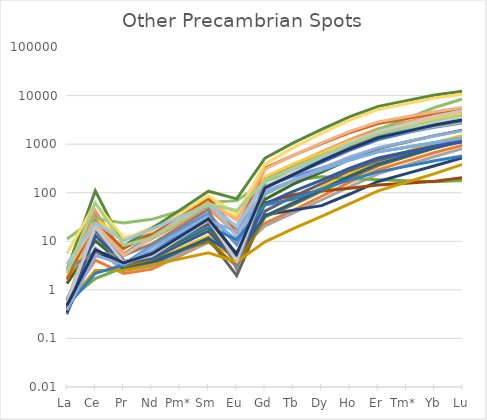
| Category | Series 0 | Series 1 | Series 2 | Series 3 | Series 4 | Series 5 | Series 6 | Series 7 | Series 8 | Series 9 | Series 10 | Series 11 | Series 12 | Series 13 | Series 14 | Series 15 | Series 16 | Series 17 | Series 18 | Series 19 | Series 20 | Series 21 | Series 22 | Series 23 | Series 24 | Series 25 | Series 26 | Series 27 | Series 28 | Series 29 | Series 30 |
|---|---|---|---|---|---|---|---|---|---|---|---|---|---|---|---|---|---|---|---|---|---|---|---|---|---|---|---|---|---|---|---|
| La | 0.314 | 0.555 | 0.654 | 1.385 | 0.463 | 0.576 | 0.344 | 0.52 | 0.404 | 0.49 | 0.594 | 1.342 | 0.463 | 1.733 | 0.566 | 1.689 | 0.499 | 11.128 | 0.441 | 1.619 | 2.714 | 0.512 | 0.46 | 2.56 | 0.384 | 2.617 | 0.536 | 5.568 | 3.427 | 2.215 | 0.479 |
| Ce | 33.59 | 4.086 | 7.234 | 14.26 | 20.554 | 1.708 | 6.051 | 17.637 | 26.353 | 17.637 | 14.935 | 10.247 | 32.414 | 42.505 | 27.645 | 29.003 | 13.965 | 29.507 | 13.022 | 25.609 | 5.874 | 2.491 | 2.196 | 109.871 | 5.074 | 22.54 | 19.523 | 61.089 | 23.946 | 61.658 | 6.712 |
| Pr | 3.387 | 2.179 | 2.515 | 3.847 | 5.496 | 2.885 | 3.571 | 3.549 | 4.029 | 3.031 | 2.629 | 3.347 | 3.417 | 5.319 | 4.997 | 10.696 | 3.192 | 23.895 | 3.682 | 7.027 | 5.077 | 2.535 | 3.25 | 7.998 | 3.351 | 5.106 | 3.722 | 11.906 | 10.194 | 8.255 | 3.59 |
| Nd | 6.089 | 2.674 | 3.059 | 3.937 | 13.261 | 4.186 | 5.981 | 4.935 | 3.376 | 4.084 | 3.714 | 5.232 | 8.194 | 11.252 | 12.01 | 19.15 | 7.467 | 28.337 | 4.526 | 14.87 | 8.824 | 3.26 | 5.746 | 18.237 | 5.975 | 12.071 | 5.037 | 15.968 | 17.857 | 11.799 | 5.531 |
| Pm* | 13.75 | 5.067 | 5.405 | 7.11 | 27.056 | 8.676 | 11.449 | 10.969 | 6.248 | 6.4 | 6.525 | 10.087 | 17.525 | 23.102 | 27.526 | 35.252 | 15.304 | 42.248 | 8.537 | 33.677 | 19.979 | 4.345 | 10.876 | 44.236 | 12.517 | 27.207 | 11.79 | 37.038 | 31.808 | 26.255 | 12.586 |
| Sm | 31.049 | 9.602 | 9.551 | 12.839 | 55.198 | 17.98 | 21.916 | 24.385 | 11.563 | 10.029 | 11.463 | 19.448 | 37.483 | 47.435 | 63.086 | 64.895 | 31.367 | 62.989 | 16.103 | 76.27 | 45.235 | 5.792 | 20.588 | 107.297 | 26.223 | 61.324 | 27.599 | 85.912 | 56.657 | 58.424 | 28.641 |
| Eu | 5.156 | 4.721 | 5.935 | 4.2 | 20.311 | 5.103 | 3.741 | 3.201 | 1.966 | 3.059 | 5.093 | 5.662 | 8.417 | 14.027 | 12.596 | 29.904 | 10.66 | 68.705 | 3.841 | 16.451 | 2.657 | 3.791 | 10.735 | 74.787 | 16.237 | 27.225 | 3.954 | 35.997 | 19.861 | 42.932 | 5.467 |
| Gd | 124.025 | 23.501 | 20.638 | 31.581 | 202.7 | 93.694 | 34.751 | 61.497 | 41.853 | 31.649 | 33.194 | 73.025 | 138.774 | 200.405 | 204.033 | 211.135 | 98.16 | 168.705 | 59.095 | 320.701 | 181.443 | 9.74 | 55.57 | 516.657 | 108.655 | 306.163 | 132.522 | 392.906 | 181.779 | 177.143 | 127.395 |
| Tb | 239.025 | 43.474 | 38.289 | 65.044 | 340.536 | 179.065 | 43.795 | 90.613 | 83.526 | 57.063 | 61.342 | 150.584 | 216.199 | 379.057 | 345.038 | 390.571 | 179.804 | 289.185 | 106.111 | 588.648 | 332.941 | 18.234 | 73.924 | 1060.006 | 179.73 | 588.653 | 283.22 | 845.184 | 309.626 | 323.11 | 235.138 |
| Dy | 421.995 | 84.649 | 70.781 | 129.611 | 559.167 | 213.868 | 54.149 | 108.182 | 153.024 | 107.326 | 115.645 | 266.901 | 323.52 | 692.405 | 572.72 | 653.473 | 292.06 | 498.472 | 181.893 | 1028.554 | 577.594 | 32.531 | 119.971 | 2007.14 | 317.378 | 1066.125 | 570.302 | 1676.021 | 509.592 | 572.196 | 450.553 |
| Ho | 754.224 | 164.62 | 133.489 | 247.714 | 899.818 | 196.943 | 94.056 | 123.514 | 287.033 | 199.785 | 220.158 | 483.755 | 486.666 | 1242.16 | 943.617 | 1138.813 | 467.043 | 966.572 | 321.511 | 1733.396 | 982.807 | 59.815 | 183.361 | 3680.766 | 544.059 | 1825.826 | 1083.781 | 3132.342 | 847.969 | 998.549 | 814.371 |
| Er | 1242.09 | 298.904 | 244.544 | 454.178 | 1345.24 | 184.78 | 170.529 | 143.598 | 466.49 | 362.84 | 390.639 | 816.461 | 695.174 | 2079.676 | 1434.426 | 1832.699 | 693.341 | 1986.798 | 520.818 | 2662.741 | 1523.232 | 109.539 | 268.449 | 6004.65 | 844.388 | 2873.164 | 1822.95 | 5177.207 | 1362.455 | 1625.616 | 1352.974 |
| Tm* | 1721.807 | 448.181 | 369.137 | 695.518 | 1734.929 | 176.063 | 247.491 | 156.896 | 644.889 | 547.706 | 574.598 | 1105.531 | 866.047 | 2830.026 | 1834.244 | 2468.726 | 866.815 | 3360.388 | 691.035 | 3369.513 | 1941.584 | 164.487 | 348.887 | 7867.903 | 1115.515 | 3659.522 | 2617.544 | 6788.834 | 1881.639 | 2212.533 | 1828.677 |
| Yb | 2386.798 | 672.01 | 557.211 | 1065.101 | 2237.505 | 167.757 | 359.188 | 171.425 | 891.513 | 826.761 | 845.186 | 1496.946 | 1078.921 | 3851.103 | 2345.504 | 3325.483 | 1083.693 | 5683.622 | 916.882 | 4263.885 | 2474.835 | 246.997 | 453.426 | 10309.326 | 1473.699 | 4661.099 | 3758.488 | 8902.148 | 2598.666 | 3011.352 | 2471.635 |
| Lu | 3098.7 | 952.137 | 812.82 | 1527.798 | 2737.131 | 179.509 | 528.408 | 205.186 | 1232.733 | 1153.314 | 1160.393 | 1957.938 | 1305.324 | 4739.76 | 2865.982 | 4184.796 | 1361.384 | 8587.825 | 1117.095 | 5129.858 | 3015.188 | 387.096 | 576.543 | 12359.248 | 1897.717 | 5742.615 | 4897.128 | 10670.115 | 3307.333 | 3909.408 | 3159.653 |